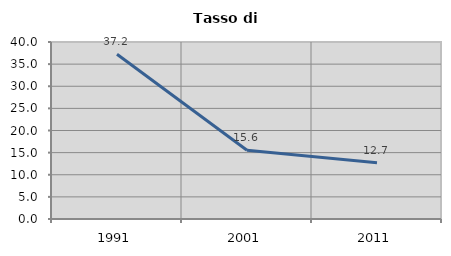
| Category | Tasso di disoccupazione   |
|---|---|
| 1991.0 | 37.218 |
| 2001.0 | 15.551 |
| 2011.0 | 12.736 |